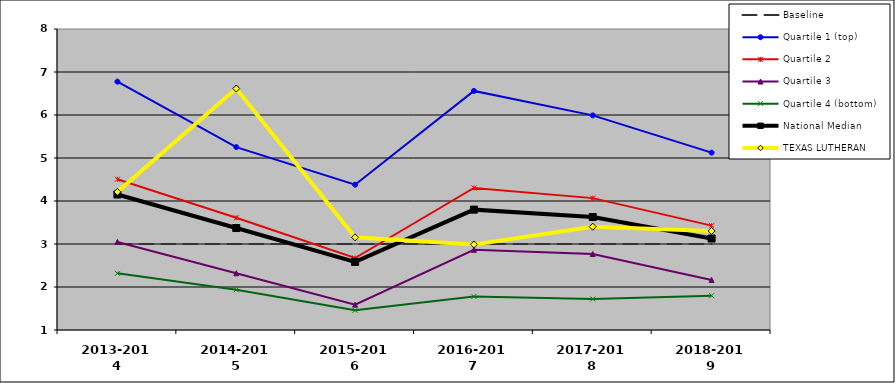
| Category | Baseline | Quartile 1 (top) | Quartile 2 | Quartile 3 | Quartile 4 (bottom) | National Median | TEXAS LUTHERAN |
|---|---|---|---|---|---|---|---|
| 2013-2014 | 3 | 6.776 | 4.506 | 3.048 | 2.319 | 4.151 | 4.212 |
| 2014-2015 | 3 | 5.254 | 3.61 | 2.319 | 1.935 | 3.372 | 6.615 |
| 2015-2016 | 3 | 4.38 | 2.674 | 1.59 | 1.457 | 2.583 | 3.155 |
| 2016-2017 | 3 | 6.56 | 4.303 | 2.864 | 1.779 | 3.799 | 2.989 |
| 2017-2018 | 3 | 5.991 | 4.067 | 2.768 | 1.721 | 3.628 | 3.403 |
| 2018-2019 | 3 | 5.124 | 3.428 | 2.164 | 1.799 | 3.127 | 3.303 |